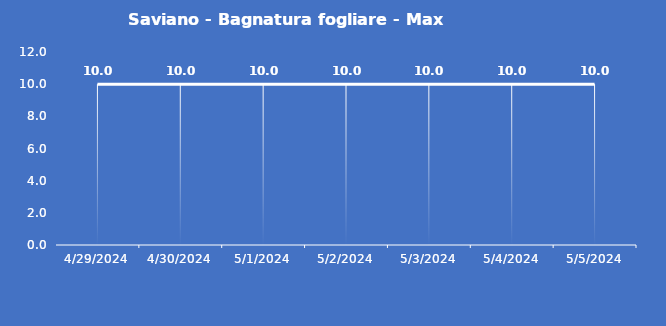
| Category | Saviano - Bagnatura fogliare - Max (min) |
|---|---|
| 4/29/24 | 10 |
| 4/30/24 | 10 |
| 5/1/24 | 10 |
| 5/2/24 | 10 |
| 5/3/24 | 10 |
| 5/4/24 | 10 |
| 5/5/24 | 10 |